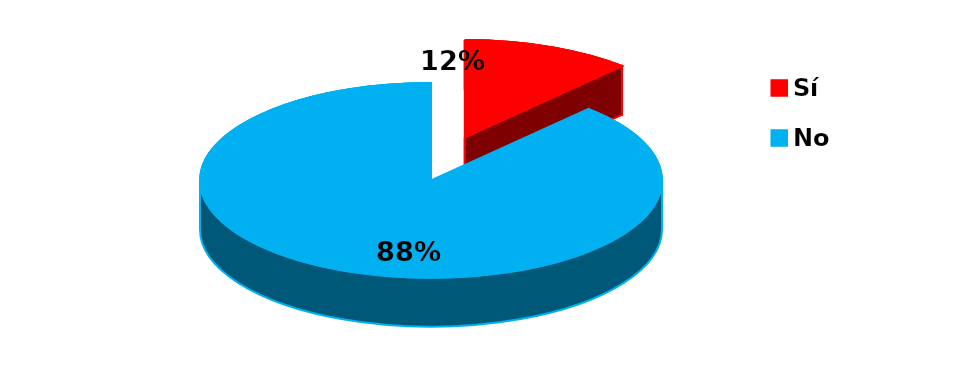
| Category | Series 0 |
|---|---|
| 0 | 5 |
| 1 | 37 |